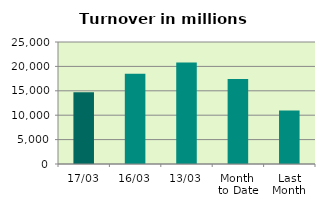
| Category | Series 0 |
|---|---|
| 17/03 | 14692.088 |
| 16/03 | 18475.333 |
| 13/03 | 20787.988 |
| Month 
to Date | 17431.196 |
| Last
Month | 10948.033 |